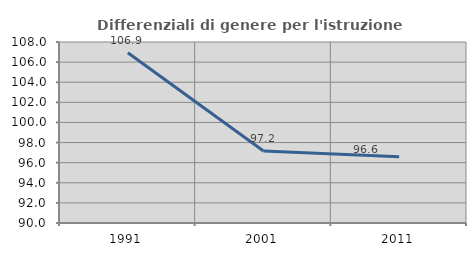
| Category | Differenziali di genere per l'istruzione superiore |
|---|---|
| 1991.0 | 106.933 |
| 2001.0 | 97.166 |
| 2011.0 | 96.596 |